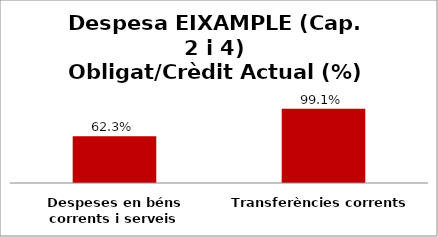
| Category | Series 0 |
|---|---|
| Despeses en béns corrents i serveis | 0.623 |
| Transferències corrents | 0.991 |